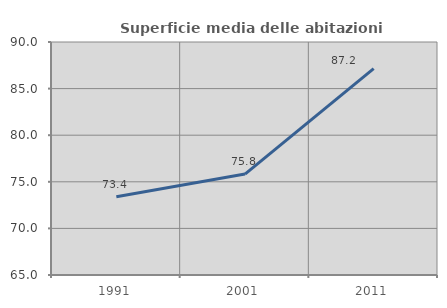
| Category | Superficie media delle abitazioni occupate |
|---|---|
| 1991.0 | 73.391 |
| 2001.0 | 75.829 |
| 2011.0 | 87.152 |